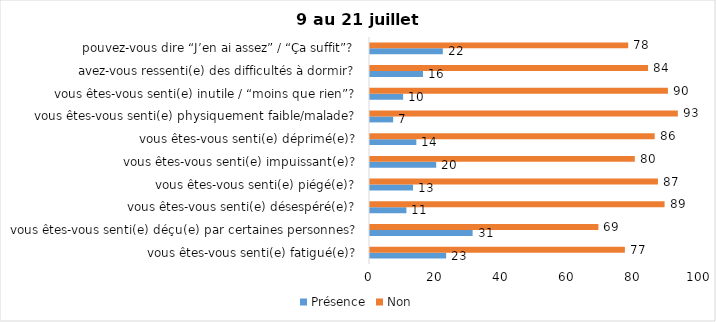
| Category | Présence | Non |
|---|---|---|
| vous êtes-vous senti(e) fatigué(e)? | 23 | 77 |
| vous êtes-vous senti(e) déçu(e) par certaines personnes? | 31 | 69 |
| vous êtes-vous senti(e) désespéré(e)? | 11 | 89 |
| vous êtes-vous senti(e) piégé(e)? | 13 | 87 |
| vous êtes-vous senti(e) impuissant(e)? | 20 | 80 |
| vous êtes-vous senti(e) déprimé(e)? | 14 | 86 |
| vous êtes-vous senti(e) physiquement faible/malade? | 7 | 93 |
| vous êtes-vous senti(e) inutile / “moins que rien”? | 10 | 90 |
| avez-vous ressenti(e) des difficultés à dormir? | 16 | 84 |
| pouvez-vous dire “J’en ai assez” / “Ça suffit”? | 22 | 78 |